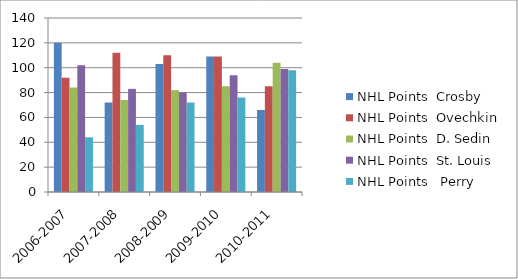
| Category | NHL Points Crosby | NHL Points Ovechkin | NHL Points D. Sedin | NHL Points St. Louis | NHL Points  Perry |
|---|---|---|---|---|---|
| 2006-2007 | 120 | 92 | 84 | 102 | 44 |
| 2007-2008 | 72 | 112 | 74 | 83 | 54 |
| 2008-2009 | 103 | 110 | 82 | 80 | 72 |
| 2009-2010 | 109 | 109 | 85 | 94 | 76 |
| 2010-2011 | 66 | 85 | 104 | 99 | 98 |